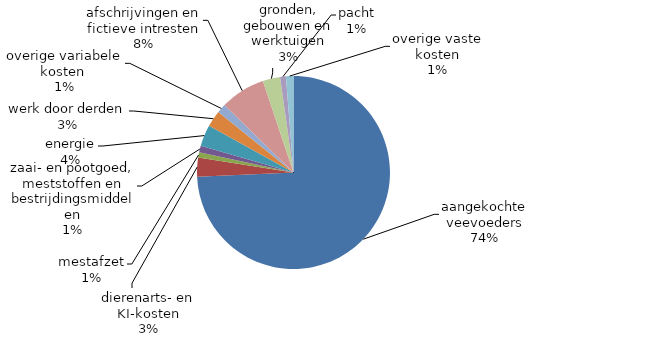
| Category | Series 4 |
|---|---|
| aangekochte veevoeders | 662485.126 |
| dierenarts- en KI-kosten | 28275.306 |
| mestafzet | 7993.273 |
| zaai- en pootgoed, meststoffen en bestrijdingsmiddelen | 9736.776 |
| energie | 31895.582 |
| werk door derden | 24499.51 |
| overige variabele kosten  | 13577.504 |
| afschrijvingen en fictieve intresten | 67390.635 |
| gronden, gebouwen en werktuigen | 25943.512 |
| pacht | 8623.307 |
| overige vaste kosten | 11216.409 |